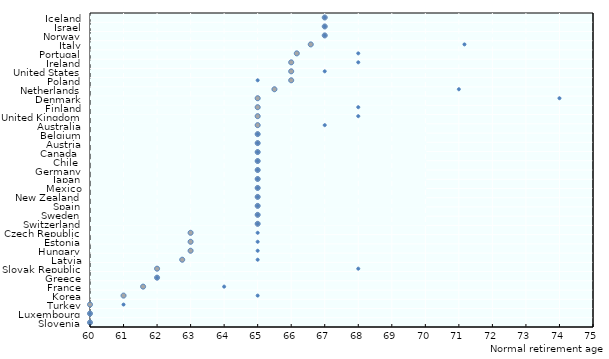
| Category | Series 0 |
|---|---|
| Iceland | 67 |
| Israel | 67 |
| Norway | 67 |
| Italy | 66.583 |
| Portugal | 66.167 |
| Ireland | 66 |
| United States | 66 |
| Poland | 66 |
| Netherlands | 65.5 |
| Denmark | 65 |
| Finland | 65 |
| United Kingdom | 65 |
| Australia | 65 |
| Belgium | 65 |
| Austria | 65 |
| Canada  | 65 |
| Chile  | 65 |
| Germany | 65 |
| Japan | 65 |
| Mexico | 65 |
| New Zealand | 65 |
| Spain | 65 |
| Sweden | 65 |
| Switzerland | 65 |
| Czech Republic | 63 |
| Estonia | 63 |
| Hungary | 63 |
| Latvia | 62.75 |
| Slovak Republic | 62 |
| Greece | 62 |
| France | 61.583 |
| Korea | 61 |
| Turkey | 60 |
| Luxembourg | 60 |
| Slovenia | 60 |